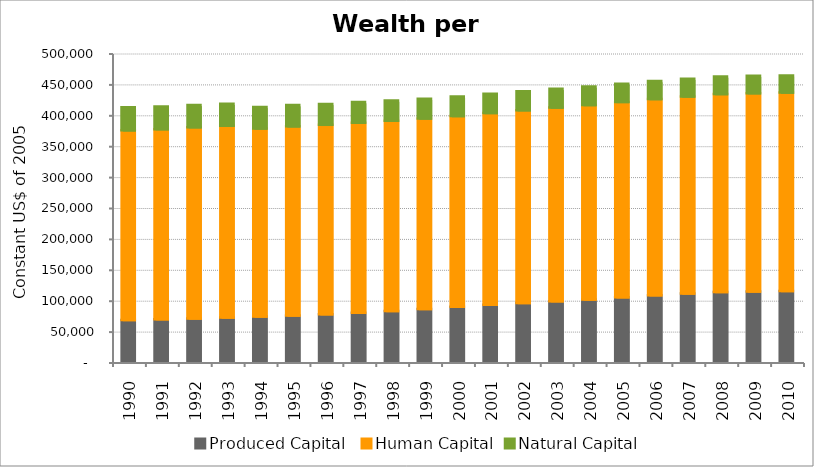
| Category | Produced Capital  | Human Capital | Natural Capital |
|---|---|---|---|
| 1990.0 | 67730.698 | 306741.397 | 37201.2 |
| 1991.0 | 68813.43 | 307601.42 | 36658.447 |
| 1992.0 | 70043.547 | 309468.917 | 36108.819 |
| 1993.0 | 71480.469 | 310526.21 | 35553.668 |
| 1994.0 | 73154.515 | 304262.78 | 34994.531 |
| 1995.0 | 74971.121 | 305894.768 | 34432.702 |
| 1996.0 | 77044.969 | 306389.795 | 33820.3 |
| 1997.0 | 79416.967 | 307514.074 | 33226.221 |
| 1998.0 | 82194.39 | 307745.252 | 32649.046 |
| 1999.0 | 85387.841 | 308256.898 | 32089.441 |
| 2000.0 | 88881.421 | 308690.556 | 31569.793 |
| 2001.0 | 92084.074 | 310460.491 | 31137.16 |
| 2002.0 | 94868.156 | 312141.333 | 30704.341 |
| 2003.0 | 97714.74 | 313554.662 | 30323.657 |
| 2004.0 | 100839.135 | 314509.584 | 29921.531 |
| 2005.0 | 104168.914 | 316295.554 | 29561.42 |
| 2006.0 | 107464.58 | 317570.282 | 29183.816 |
| 2007.0 | 110411.418 | 318781.278 | 28877.216 |
| 2008.0 | 112687.78 | 320425.493 | 28548.548 |
| 2009.0 | 113590.206 | 321009.622 | 28183.58 |
| 2010.0 | 114513.303 | 321025.697 | 27836.127 |